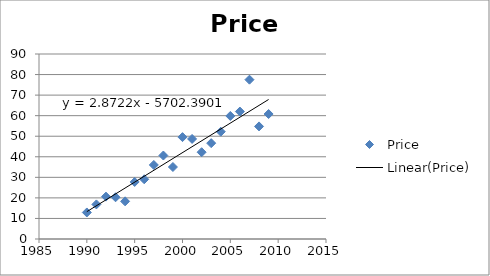
| Category | Price |
|---|---|
| 1990.0 | 12.914 |
| 1991.0 | 16.825 |
| 1992.0 | 20.612 |
| 1993.0 | 20.302 |
| 1994.0 | 18.316 |
| 1995.0 | 27.754 |
| 1996.0 | 29.058 |
| 1997.0 | 36.016 |
| 1998.0 | 40.611 |
| 1999.0 | 35.023 |
| 2000.0 | 49.562 |
| 2001.0 | 48.68 |
| 2002.0 | 42.22 |
| 2003.0 | 46.62 |
| 2004.0 | 52.2 |
| 2005.0 | 59.85 |
| 2006.0 | 62 |
| 2007.0 | 77.51 |
| 2008.0 | 54.77 |
| 2009.0 | 60.8 |